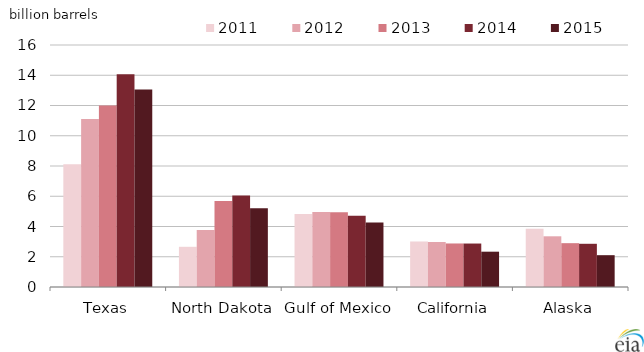
| Category | 2011 | 2012 | 2013 | 2014 | 2015 |
|---|---|---|---|---|---|
| Texas | 8.108 | 11.101 | 12.004 | 14.058 | 13.057 |
| North Dakota | 2.658 | 3.773 | 5.683 | 6.045 | 5.207 |
| Gulf of Mexico | 4.819 | 4.956 | 4.95 | 4.704 | 4.27 |
| California | 3.009 | 2.976 | 2.878 | 2.874 | 2.335 |
| Alaska | 3.852 | 3.352 | 2.898 | 2.857 | 2.104 |